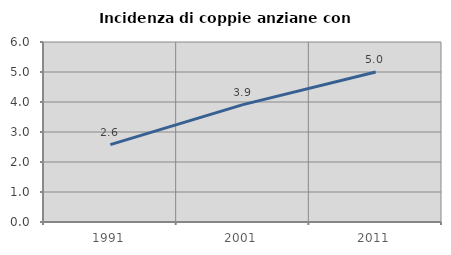
| Category | Incidenza di coppie anziane con figli |
|---|---|
| 1991.0 | 2.577 |
| 2001.0 | 3.912 |
| 2011.0 | 5 |